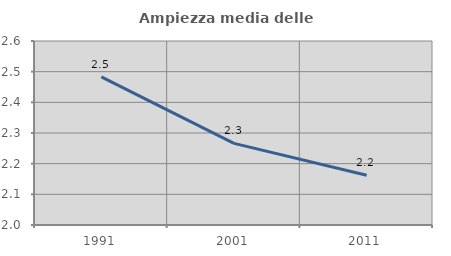
| Category | Ampiezza media delle famiglie |
|---|---|
| 1991.0 | 2.483 |
| 2001.0 | 2.266 |
| 2011.0 | 2.162 |